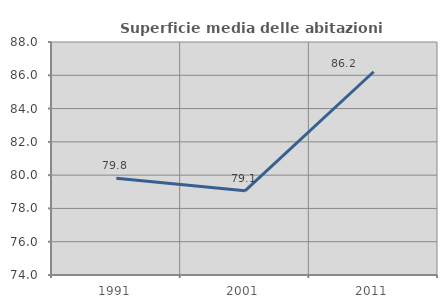
| Category | Superficie media delle abitazioni occupate |
|---|---|
| 1991.0 | 79.815 |
| 2001.0 | 79.057 |
| 2011.0 | 86.213 |